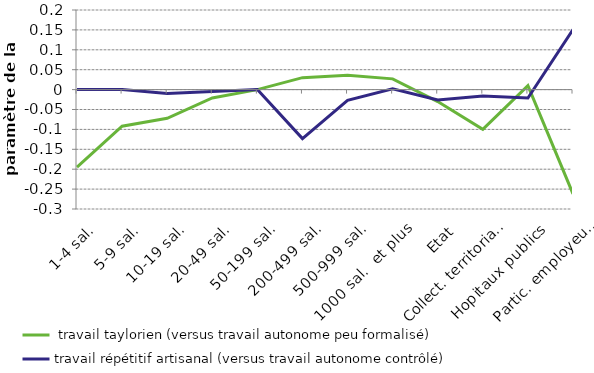
| Category |  travail taylorien (versus travail autonome peu formalisé) | travail répétitif artisanal (versus travail autonome contrôlé) |
|---|---|---|
|  1-4 sal. | -0.195 | 0 |
|  5-9 sal. | -0.092 | 0 |
|  10-19 sal. | -0.072 | -0.01 |
| 20-49 sal. | -0.021 | -0.005 |
|  50-199 sal. | 0 | 0 |
|  200-499 sal. | 0.03 | -0.123 |
|  500-999 sal. | 0.036 | -0.027 |
|  1000 sal.  et plus | 0.027 | 0.002 |
| Etat | -0.03 | -0.026 |
| Collect. territoriales | -0.1 | -0.016 |
| Hopitaux publics | 0.01 | -0.021 |
| Partic. employeurs | -0.262 | 0.151 |